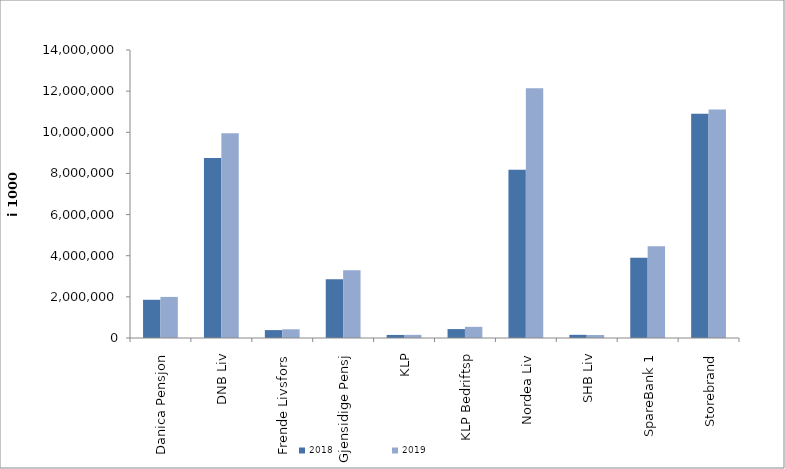
| Category | 2018 | 2019 |
|---|---|---|
| Danica Pensjon | 1858117.182 | 1996554.923 |
| DNB Liv | 8751380.894 | 9947581.5 |
| Frende Livsfors | 383502.5 | 423019 |
| Gjensidige Pensj | 2849928 | 3290851 |
| KLP | 148957.792 | 152808.771 |
| KLP Bedriftsp | 432767 | 542528 |
| Nordea Liv | 8182157.738 | 12142064.529 |
| SHB Liv | 153887 | 145834.708 |
| SpareBank 1 | 3902966.411 | 4457595.799 |
| Storebrand | 10907068.207 | 11112376.758 |